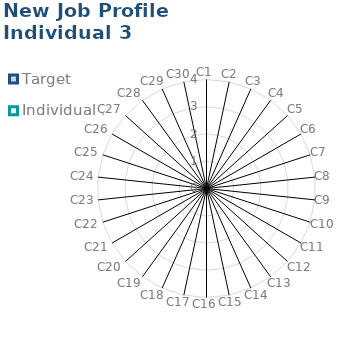
| Category | Target | Individual 3 |
|---|---|---|
| C1 | 0 | 0 |
| C2 | 0 | 0 |
| C3 | 0 | 0 |
| C4 | 0 | 0 |
| C5 | 0 | 0 |
| C6 | 0 | 0 |
| C7 | 0 | 0 |
| C8 | 0 | 0 |
| C9 | 0 | 0 |
| C10 | 0 | 0 |
| C11 | 0 | 0 |
| C12 | 0 | 0 |
| C13 | 0 | 0 |
| C14 | 0 | 0 |
| C15 | 0 | 0 |
| C16 | 0 | 0 |
| C17 | 0 | 0 |
| C18 | 0 | 0 |
| C19 | 0 | 0 |
| C20 | 0 | 0 |
| C21 | 0 | 0 |
| C22 | 0 | 0 |
| C23 | 0 | 0 |
| C24 | 0 | 0 |
| C25 | 0 | 0 |
| C26 | 0 | 0 |
| C27 | 0 | 0 |
| C28 | 0 | 0 |
| C29 | 0 | 0 |
| C30 | 0 | 0 |